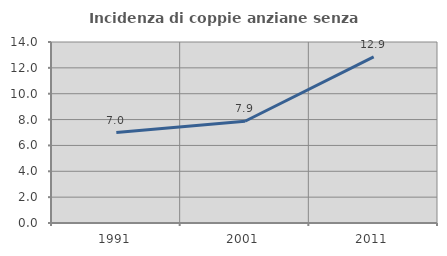
| Category | Incidenza di coppie anziane senza figli  |
|---|---|
| 1991.0 | 6.992 |
| 2001.0 | 7.869 |
| 2011.0 | 12.856 |